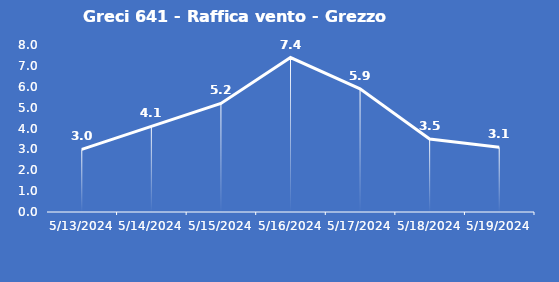
| Category | Greci 641 - Raffica vento - Grezzo (m/s) |
|---|---|
| 5/13/24 | 3 |
| 5/14/24 | 4.1 |
| 5/15/24 | 5.2 |
| 5/16/24 | 7.4 |
| 5/17/24 | 5.9 |
| 5/18/24 | 3.5 |
| 5/19/24 | 3.1 |